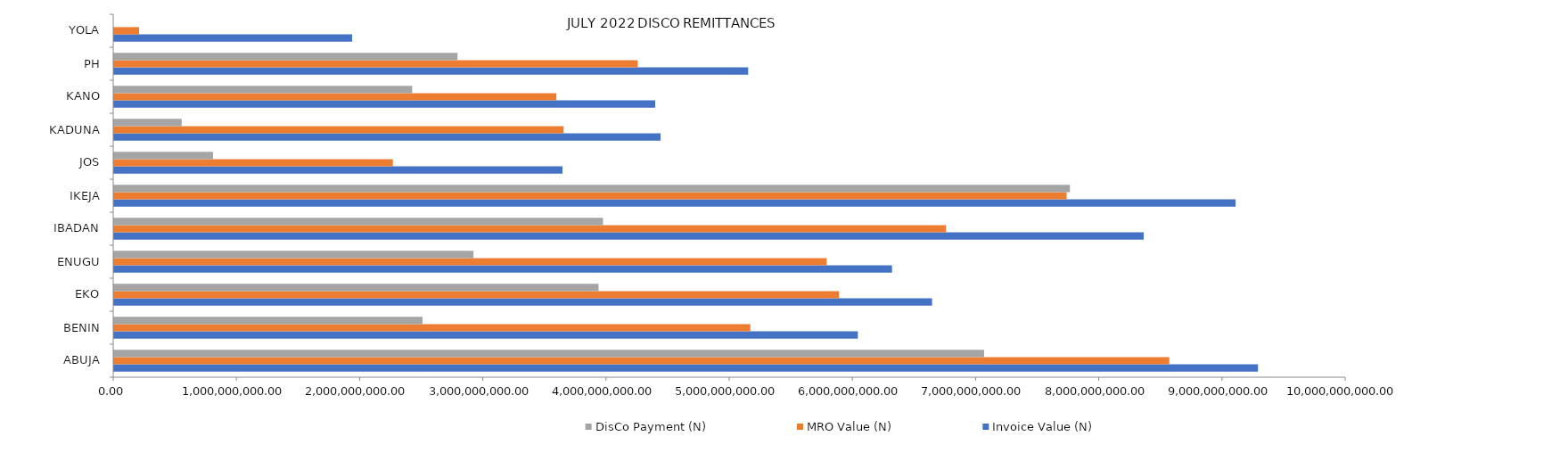
| Category | Invoice Value (N) | MRO Value (N) | DisCo Payment (N) |
|---|---|---|---|
| ABUJA | 9285099033.569 | 8565503858.467 | 7061867512.69 |
| BENIN | 6037342466.599 | 5164342745.929 | 2503367958.59 |
| EKO | 6639926170.252 | 5884302572.077 | 3932635053.52 |
| ENUGU | 6314601891.6 | 5784175332.706 | 2917047773.62 |
| IBADAN | 8357879508.912 | 6752330855.25 | 3968592357.45 |
| IKEJA | 9103734030.132 | 7731801311.791 | 7758759270.11 |
| JOS | 3639689399.335 | 2262794899.567 | 803093426.76 |
| KADUNA | 4435546881.83 | 3648680864.993 | 548500373.21 |
| KANO | 4392099374.287 | 3589662818.605 | 2419508698.09 |
| PH | 5147040240.319 | 4250425830.455 | 2787452718.3 |
| YOLA | 1932175232.886 | 202878399.453 | 0 |